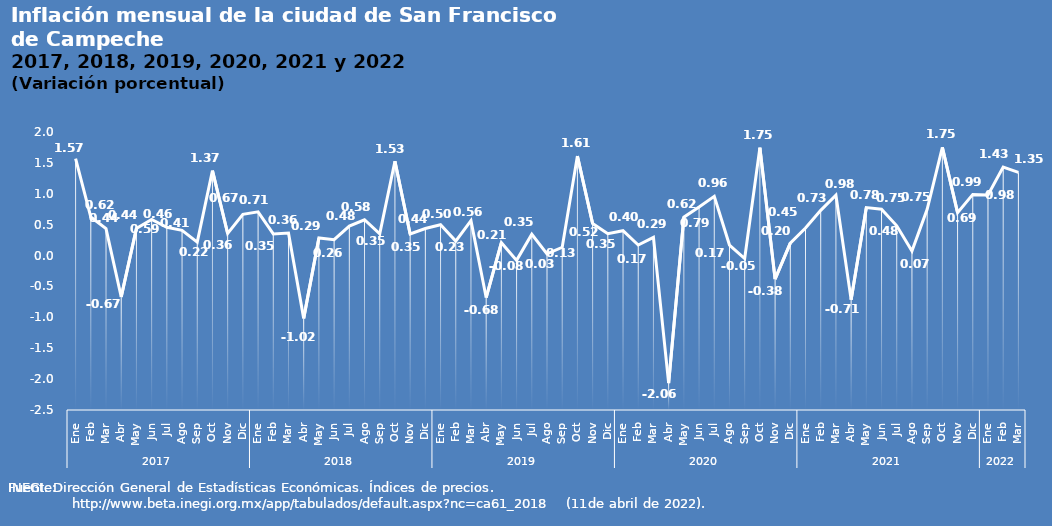
| Category | Inflación |
|---|---|
| 0 | 1.568 |
| 1 | 0.623 |
| 2 | 0.437 |
| 3 | -0.669 |
| 4 | 0.44 |
| 5 | 0.585 |
| 6 | 0.458 |
| 7 | 0.409 |
| 8 | 0.217 |
| 9 | 1.374 |
| 10 | 0.357 |
| 11 | 0.667 |
| 12 | 0.707 |
| 13 | 0.35 |
| 14 | 0.364 |
| 15 | -1.017 |
| 16 | 0.285 |
| 17 | 0.257 |
| 18 | 0.477 |
| 19 | 0.58 |
| 20 | 0.351 |
| 21 | 1.526 |
| 22 | 0.35 |
| 23 | 0.438 |
| 24 | 0.498 |
| 25 | 0.234 |
| 26 | 0.564 |
| 27 | -0.679 |
| 28 | 0.208 |
| 29 | -0.078 |
| 30 | 0.345 |
| 31 | 0.026 |
| 32 | 0.134 |
| 33 | 1.61 |
| 34 | 0.518 |
| 35 | 0.353 |
| 36 | 0.403 |
| 37 | 0.17 |
| 38 | 0.294 |
| 39 | -2.064 |
| 40 | 0.621 |
| 41 | 0.786 |
| 42 | 0.958 |
| 43 | 0.17 |
| 44 | -0.049 |
| 45 | 1.746 |
| 46 | -0.383 |
| 47 | 0.202 |
| 48 | 0.446 |
| 49 | 0.731 |
| 50 | 0.976 |
| 51 | -0.714 |
| 52 | 0.777 |
| 53 | 0.75 |
| 54 | 0.481 |
| 55 | 0.073 |
| 56 | 0.75 |
| 57 | 1.751 |
| 58 | 0.694 |
| 59 | 0.99 |
| 60 | 0.98 |
| 61 | 1.432 |
| 62 | 1.346 |